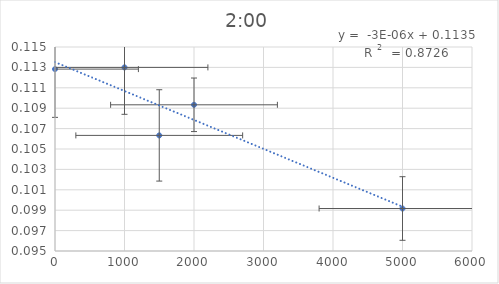
| Category | Series 0 |
|---|---|
| 5000.0 | 0.099 |
| 2000.0 | 0.109 |
| 1500.0 | 0.106 |
| 1000.0 | 0.113 |
| 0.0 | 0.113 |